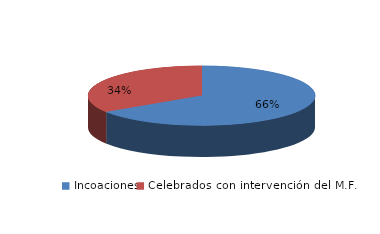
| Category | Series 0 |
|---|---|
| Incoaciones | 48130 |
| Celebrados con intervención del M.F. | 25080 |